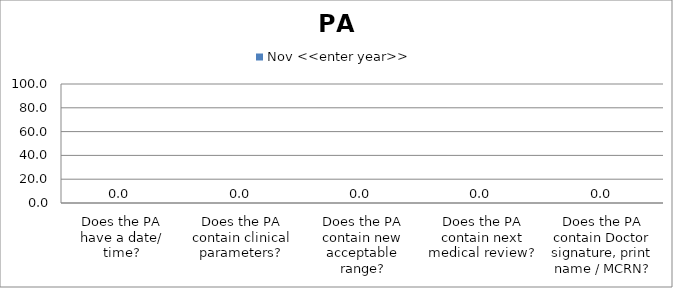
| Category | Nov <<enter year>> |
|---|---|
| Does the PA have a date/ time? | 0 |
| Does the PA contain clinical parameters? | 0 |
| Does the PA contain new acceptable range? | 0 |
| Does the PA contain next medical review? | 0 |
| Does the PA contain Doctor signature, print name / MCRN? | 0 |